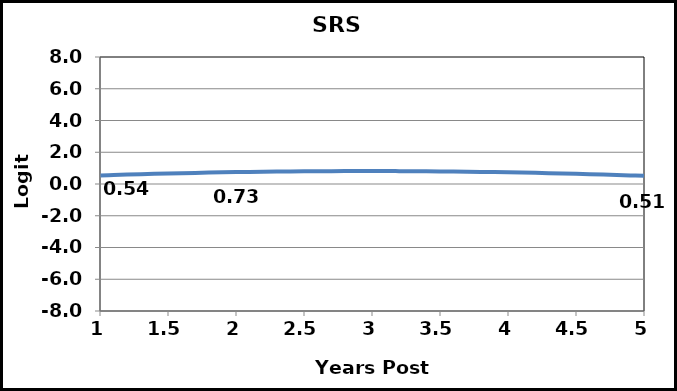
| Category | SRS prob |
|---|---|
| 1.0 | 0.539 |
| 1.1 | 0.566 |
| 1.2 | 0.592 |
| 1.3 | 0.617 |
| 1.4 | 0.64 |
| 1.5 | 0.662 |
| 1.6 | 0.682 |
| 1.7 | 0.701 |
| 1.8 | 0.718 |
| 1.9 | 0.734 |
| 2.0 | 0.749 |
| 2.1 | 0.762 |
| 2.2 | 0.773 |
| 2.3 | 0.783 |
| 2.4 | 0.792 |
| 2.5 | 0.799 |
| 2.6 | 0.805 |
| 2.7 | 0.81 |
| 2.8 | 0.813 |
| 2.9 | 0.814 |
| 3.0 | 0.814 |
| 3.1 | 0.813 |
| 3.2 | 0.81 |
| 3.3 | 0.806 |
| 3.4 | 0.8 |
| 3.5 | 0.793 |
| 3.6 | 0.785 |
| 3.7 | 0.775 |
| 3.8 | 0.763 |
| 3.9 | 0.75 |
| 4.0 | 0.736 |
| 4.1 | 0.72 |
| 4.2 | 0.703 |
| 4.3 | 0.685 |
| 4.4 | 0.664 |
| 4.5 | 0.643 |
| 4.6 | 0.62 |
| 4.7 | 0.596 |
| 4.8 | 0.57 |
| 4.9 | 0.542 |
| 5.0 | 0.514 |